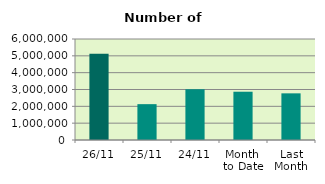
| Category | Series 0 |
|---|---|
| 26/11 | 5121654 |
| 25/11 | 2129568 |
| 24/11 | 3014972 |
| Month 
to Date | 2867672.3 |
| Last
Month | 2771381.143 |